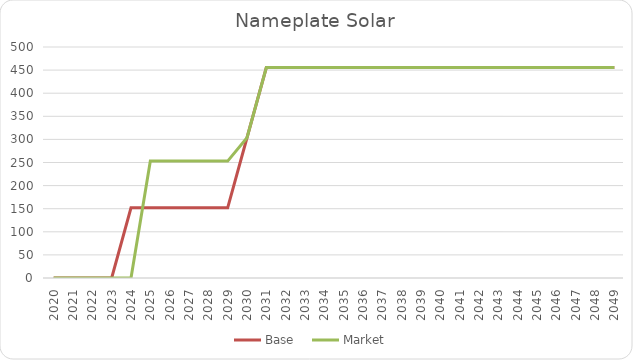
| Category | Base | Market |
|---|---|---|
| 2020.0 | 0 | 0 |
| 2021.0 | 0 | 0 |
| 2022.0 | 0 | 0 |
| 2023.0 | 0 | 0 |
| 2024.0 | 151.796 | 0 |
| 2025.0 | 151.796 | 252.994 |
| 2026.0 | 151.796 | 252.994 |
| 2027.0 | 151.796 | 252.994 |
| 2028.0 | 151.796 | 252.994 |
| 2029.0 | 151.796 | 252.994 |
| 2030.0 | 303.593 | 303.593 |
| 2031.0 | 455.389 | 455.389 |
| 2032.0 | 455.389 | 455.389 |
| 2033.0 | 455.389 | 455.389 |
| 2034.0 | 455.389 | 455.389 |
| 2035.0 | 455.389 | 455.389 |
| 2036.0 | 455.389 | 455.389 |
| 2037.0 | 455.389 | 455.389 |
| 2038.0 | 455.389 | 455.389 |
| 2039.0 | 455.389 | 455.389 |
| 2040.0 | 455.389 | 455.389 |
| 2041.0 | 455.389 | 455.389 |
| 2042.0 | 455.389 | 455.389 |
| 2043.0 | 455.389 | 455.389 |
| 2044.0 | 455.389 | 455.389 |
| 2045.0 | 455.389 | 455.389 |
| 2046.0 | 455.389 | 455.389 |
| 2047.0 | 455.389 | 455.389 |
| 2048.0 | 455.389 | 455.389 |
| 2049.0 | 455.389 | 455.389 |